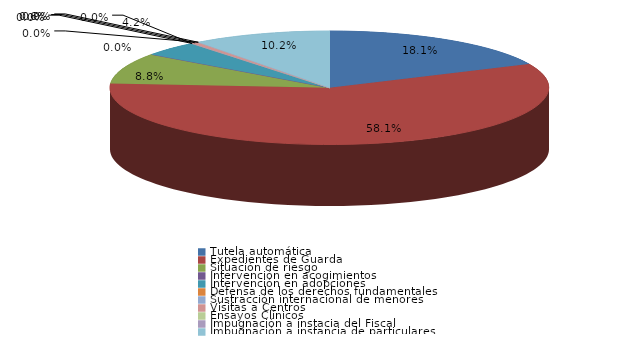
| Category | Series 0 |
|---|---|
| Tutela automática | 64 |
| Expedientes de Guarda | 205 |
| Situación de riesgo | 31 |
| Intervención en acogimientos | 0 |
| Intervención en adopciones | 15 |
| Defensa de los derechos fundamentales | 0 |
| Sustracción internacional de menores | 0 |
| Visitas a Centros | 2 |
| Ensayos Clínicos | 0 |
| Impugnación a instacia del Fiscal | 0 |
| Impugnación a instancia de particulares | 36 |